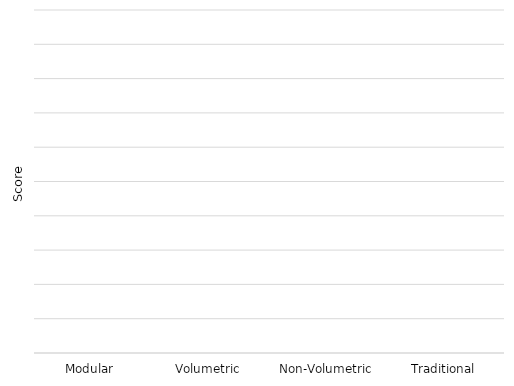
| Category | Series 0 |
|---|---|
| Modular  | 0 |
| Volumetric | 0 |
| Non-Volumetric | 0 |
| Traditional | 0 |